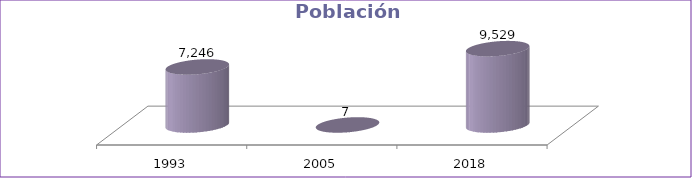
| Category | Población Total |
|---|---|
| 1993 | 7246 |
| 2005 | 7.1 |
| 2018 | 9529 |